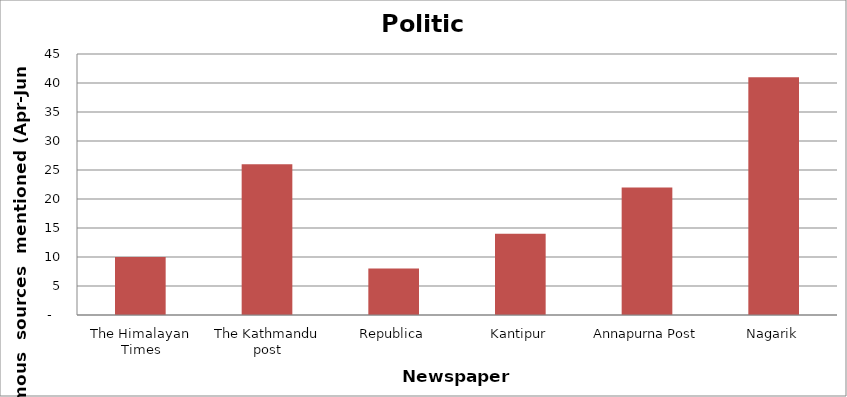
| Category | Politics |
|---|---|
| The Himalayan Times | 10 |
| The Kathmandu post | 26 |
| Republica | 8 |
| Kantipur | 14 |
| Annapurna Post | 22 |
| Nagarik | 41 |